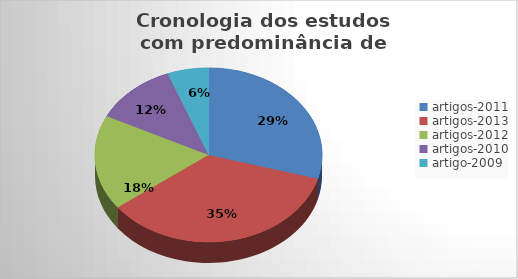
| Category | Series 0 |
|---|---|
| artigos-2011 | 5 |
| artigos-2013 | 6 |
| artigos-2012 | 3 |
| artigos-2010 | 2 |
| artigo-2009 | 1 |